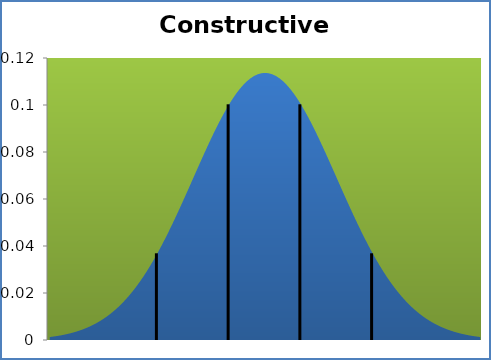
| Category | densité |
|---|---|
| 6.720000000000001 | 0.001 |
| 6.895500000000002 | 0.001 |
| 7.0710000000000015 | 0.002 |
| 7.246500000000001 | 0.002 |
| 7.422000000000001 | 0.002 |
| 7.5975 | 0.003 |
| 7.773 | 0.003 |
| 7.948499999999999 | 0.003 |
| 8.124 | 0.004 |
| 8.2995 | 0.004 |
| 8.475 | 0.005 |
| 8.650500000000001 | 0.006 |
| 8.826 | 0.006 |
| 9.0015 | 0.007 |
| 9.177000000000001 | 0.008 |
| 9.352500000000001 | 0.009 |
| 9.528 | 0.01 |
| 9.703500000000002 | 0.011 |
| 9.879000000000001 | 0.013 |
| 10.0545 | 0.014 |
| 10.23 | 0.015 |
| 10.4055 | 0.017 |
| 10.581 | 0.019 |
| 10.756499999999999 | 0.021 |
| 10.932 | 0.022 |
| 11.1075 | 0.025 |
| 11.283000000000001 | 0.027 |
| 11.4585 | 0.029 |
| 11.634 | 0.032 |
| 11.8095 | 0.034 |
| 11.985 | 0.037 |
| 12.1605 | 0.04 |
| 12.336 | 0.043 |
| 12.5115 | 0.046 |
| 12.687000000000001 | 0.049 |
| 12.8625 | 0.052 |
| 13.038 | 0.055 |
| 13.2135 | 0.059 |
| 13.389 | 0.062 |
| 13.5645 | 0.065 |
| 13.74 | 0.069 |
| 13.9155 | 0.072 |
| 14.091000000000001 | 0.076 |
| 14.2665 | 0.079 |
| 14.442 | 0.083 |
| 14.6175 | 0.086 |
| 14.793 | 0.089 |
| 14.9685 | 0.092 |
| 15.144 | 0.095 |
| 15.3195 | 0.098 |
| 15.495000000000001 | 0.1 |
| 15.6705 | 0.103 |
| 15.846 | 0.105 |
| 16.0215 | 0.107 |
| 16.197 | 0.109 |
| 16.3725 | 0.11 |
| 16.548000000000002 | 0.111 |
| 16.7235 | 0.112 |
| 16.899 | 0.113 |
| 17.0745 | 0.114 |
| 17.25 | 0.114 |
| 17.4255 | 0.114 |
| 17.601 | 0.113 |
| 17.7765 | 0.112 |
| 17.951999999999998 | 0.111 |
| 18.1275 | 0.11 |
| 18.303 | 0.109 |
| 18.4785 | 0.107 |
| 18.654 | 0.105 |
| 18.8295 | 0.103 |
| 19.005 | 0.1 |
| 19.1805 | 0.098 |
| 19.356 | 0.095 |
| 19.5315 | 0.092 |
| 19.707 | 0.089 |
| 19.8825 | 0.086 |
| 20.058 | 0.083 |
| 20.2335 | 0.079 |
| 20.409 | 0.076 |
| 20.5845 | 0.072 |
| 20.759999999999998 | 0.069 |
| 20.9355 | 0.065 |
| 21.111 | 0.062 |
| 21.2865 | 0.059 |
| 21.462 | 0.055 |
| 21.6375 | 0.052 |
| 21.813 | 0.049 |
| 21.988500000000002 | 0.046 |
| 22.164 | 0.043 |
| 22.3395 | 0.04 |
| 22.515 | 0.037 |
| 22.6905 | 0.034 |
| 22.866 | 0.032 |
| 23.0415 | 0.029 |
| 23.217 | 0.027 |
| 23.3925 | 0.025 |
| 23.567999999999998 | 0.022 |
| 23.7435 | 0.021 |
| 23.919 | 0.019 |
| 24.0945 | 0.017 |
| 24.27 | 0.015 |
| 24.4455 | 0.014 |
| 24.621 | 0.013 |
| 24.796499999999998 | 0.011 |
| 24.972 | 0.01 |
| 25.1475 | 0.009 |
| 25.323 | 0.008 |
| 25.4985 | 0.007 |
| 25.674 | 0.006 |
| 25.8495 | 0.006 |
| 26.025 | 0.005 |
| 26.200499999999998 | 0.004 |
| 26.375999999999998 | 0.004 |
| 26.5515 | 0.003 |
| 26.727 | 0.003 |
| 26.9025 | 0.003 |
| 27.078 | 0.002 |
| 27.2535 | 0.002 |
| 27.429 | 0.002 |
| 27.604499999999998 | 0.001 |
| 27.78 | 0.001 |